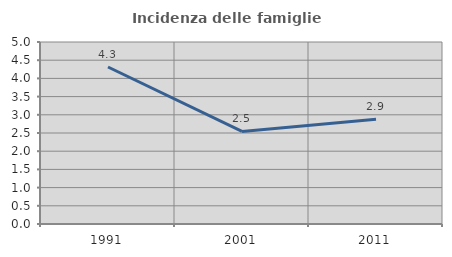
| Category | Incidenza delle famiglie numerose |
|---|---|
| 1991.0 | 4.313 |
| 2001.0 | 2.543 |
| 2011.0 | 2.876 |